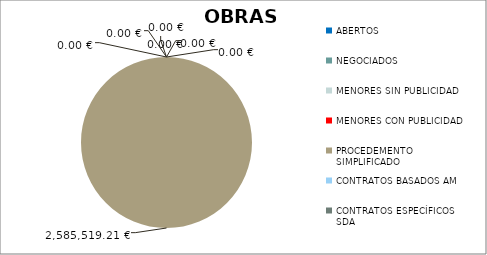
| Category | Series 0 |
|---|---|
| ABERTOS  | 0 |
| NEGOCIADOS  | 0 |
| MENORES SIN PUBLICIDAD | 0 |
| MENORES CON PUBLICIDAD | 0 |
| PROCEDEMENTO SIMPLIFICADO | 2585519.21 |
| CONTRATOS BASADOS AM | 0 |
| CONTRATOS ESPECÍFICOS SDA | 0 |